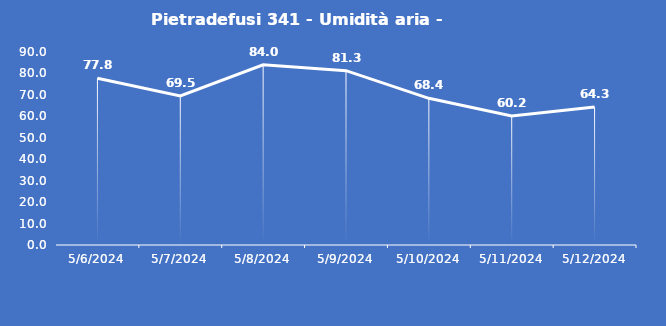
| Category | Pietradefusi 341 - Umidità aria - Grezzo (%) |
|---|---|
| 5/6/24 | 77.8 |
| 5/7/24 | 69.5 |
| 5/8/24 | 84 |
| 5/9/24 | 81.3 |
| 5/10/24 | 68.4 |
| 5/11/24 | 60.2 |
| 5/12/24 | 64.3 |